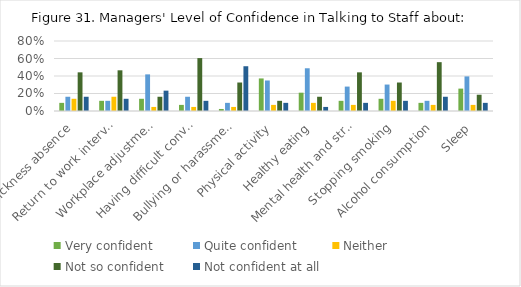
| Category | Very confident | Quite confident | Neither  | Not so confident | Not confident at all  |
|---|---|---|---|---|---|
| Sickness absence | 0.093 | 0.163 | 0.14 | 0.442 | 0.163 |
| Return to work interviews | 0.116 | 0.116 | 0.163 | 0.465 | 0.14 |
| Workplace adjustments | 0.14 | 0.419 | 0.047 | 0.163 | 0.233 |
| Having difficult conversations | 0.07 | 0.163 | 0.047 | 0.605 | 0.116 |
| Bullying or harassment  | 0.023 | 0.093 | 0.047 | 0.326 | 0.512 |
| Physical activity | 0.372 | 0.349 | 0.07 | 0.116 | 0.093 |
| Healthy eating | 0.209 | 0.488 | 0.093 | 0.163 | 0.047 |
| Mental health and stress | 0.116 | 0.279 | 0.07 | 0.442 | 0.093 |
| Stopping smoking | 0.14 | 0.302 | 0.116 | 0.326 | 0.116 |
| Alcohol consumption | 0.093 | 0.116 | 0.07 | 0.558 | 0.163 |
| Sleep | 0.256 | 0.395 | 0.07 | 0.186 | 0.093 |